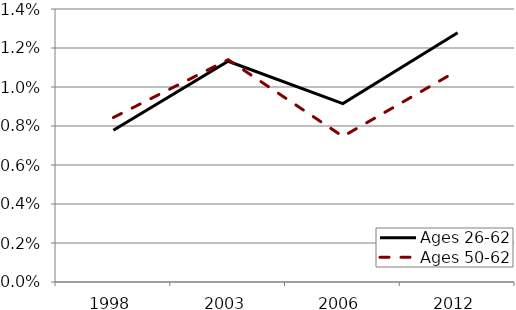
| Category | Ages 26-62 | Ages 50-62 |
|---|---|---|
| 1998.0 | 0.008 | 0.008 |
| 2003.0 | 0.011 | 0.011 |
| 2006.0 | 0.009 | 0.007 |
| 2012.0 | 0.013 | 0.011 |